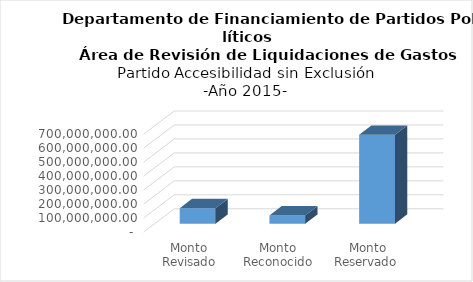
| Category | Series 0 |
|---|---|
| Monto Revisado (DFPP) | 110894749.23 |
| Monto Reconocido (TSE) | 58992724 |
| Monto Reservado  | 635795722.6 |